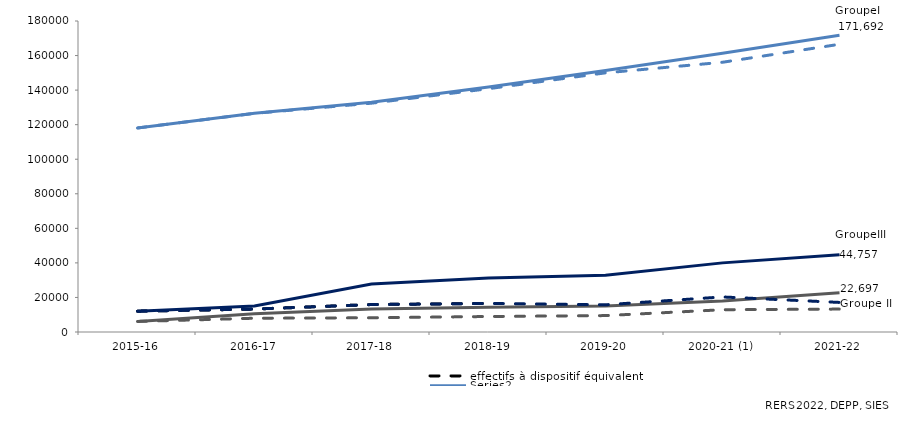
| Category | effectifs à dispositif équivalent | Series 7 | Series 8 | Series 9 | Series 10 | Series 11 | Series 12 |
|---|---|---|---|---|---|---|---|
| 2015-16 |  | 118089 | 118089 | 6111 | 6111 | 12044 | 12044 |
| 2016-17 |  | 126544 | 126544 | 10494 | 7969 | 15042 | 13279 |
| 2017-18 |  | 132979 | 132430 | 13289 | 8234 | 27824 | 15887 |
| 2018-19 |  | 141821 | 140819 | 14349 | 8972 | 31258 | 16524 |
| 2019-20 |  | 151377 | 149995 | 15006 | 9495 | 32842 | 15753 |
| 2020-21 (1) |  | 161383 | 156112 | 17945 | 12890 | 40009 | 20287 |
| 2021-22 |  | 171692 | 166528 | 22697 | 13264 | 44757 | 17114 |